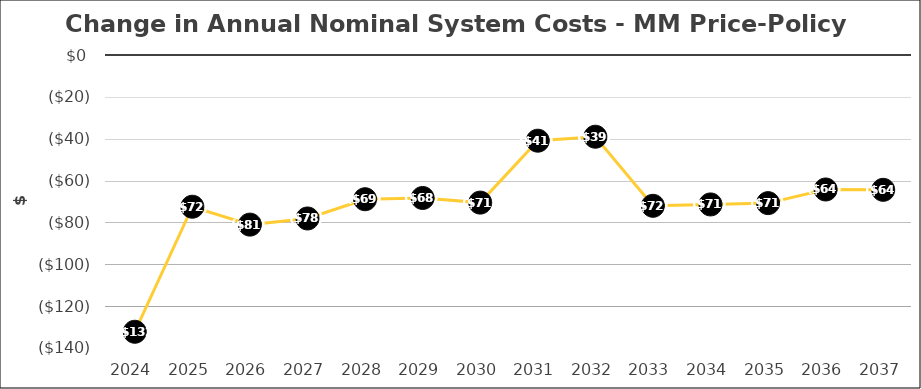
| Category | MM |
|---|---|
| 2024.0 | -132.247 |
| 2025.0 | -72.496 |
| 2026.0 | -81.047 |
| 2027.0 | -78.115 |
| 2028.0 | -68.911 |
| 2029.0 | -68.32 |
| 2030.0 | -70.525 |
| 2031.0 | -40.949 |
| 2032.0 | -39.049 |
| 2033.0 | -72.061 |
| 2034.0 | -71.404 |
| 2035.0 | -70.772 |
| 2036.0 | -64.264 |
| 2037.0 | -64.423 |